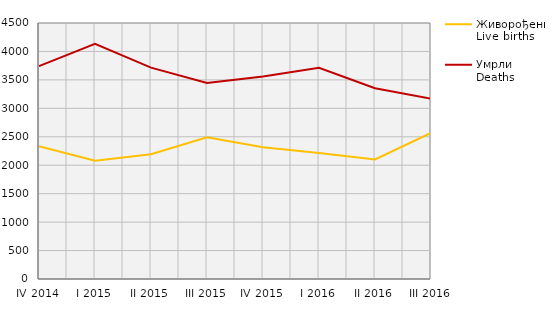
| Category | Живорођени
Live births | Умрли
Deaths |
|---|---|---|
| IV 2014 | 2332 | 3743 |
| I 2015 | 2078 | 4132 |
| II 2015 | 2194 | 3716 |
| III 2015 | 2492 | 3444 |
| IV 2015 | 2315 | 3560 |
| I 2016 | 2216 | 3714 |
| II 2016 | 2101 | 3353 |
| III 2016 | 2570 | 3171 |